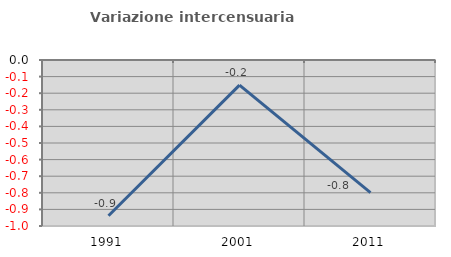
| Category | Variazione intercensuaria annua |
|---|---|
| 1991.0 | -0.938 |
| 2001.0 | -0.151 |
| 2011.0 | -0.799 |